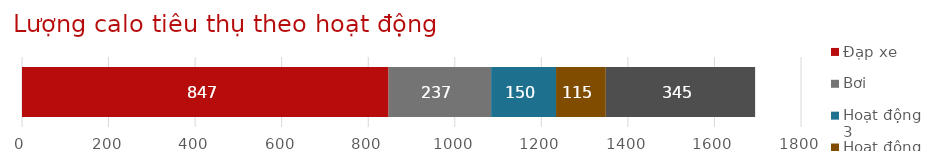
| Category | Đạp xe | Bơi | Hoạt động 3 | Hoạt động 4 | Hoạt động 5 |
|---|---|---|---|---|---|
| Công cụ theo dõi hoạt động | 847 | 237 | 150 | 115 | 345 |